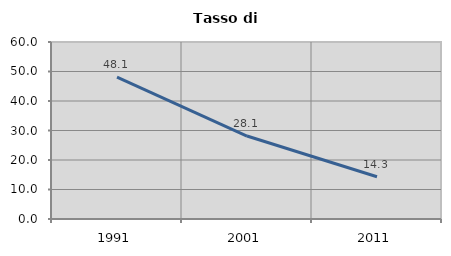
| Category | Tasso di disoccupazione   |
|---|---|
| 1991.0 | 48.102 |
| 2001.0 | 28.128 |
| 2011.0 | 14.319 |